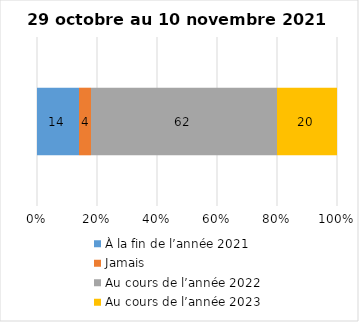
| Category | À la fin de l’année 2021 | Jamais | Au cours de l’année 2022 | Au cours de l’année 2023 |
|---|---|---|---|---|
| 0 | 14 | 4 | 62 | 20 |